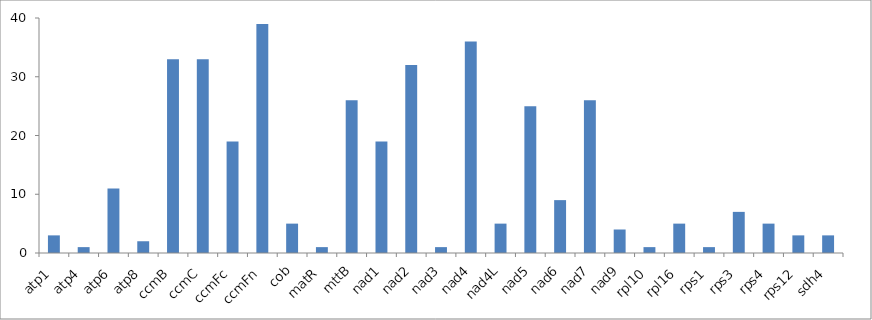
| Category | Number of sites |
|---|---|
| atp1 | 3 |
| atp4 | 1 |
| atp6 | 11 |
| atp8 | 2 |
| ccmB | 33 |
| ccmC | 33 |
| ccmFc | 19 |
| ccmFn | 39 |
| cob | 5 |
| matR | 1 |
| mttB | 26 |
| nad1 | 19 |
| nad2 | 32 |
| nad3 | 1 |
| nad4 | 36 |
| nad4L | 5 |
| nad5 | 25 |
| nad6 | 9 |
| nad7 | 26 |
| nad9 | 4 |
| rpl10 | 1 |
| rpl16 | 5 |
| rps1 | 1 |
| rps3 | 7 |
| rps4 | 5 |
| rps12 | 3 |
| sdh4 | 3 |